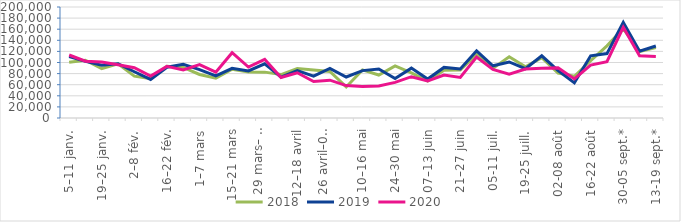
| Category | 2018 | 2019 | 2020 |
|---|---|---|---|
| 5–11 janv. | 100330 | 110701 | 113506 |
| 12–18 janv. | 104190 | 102045 | 102407 |
| 19–25 janv. | 89142 | 95260 | 100966 |
| 26 janv.–1 fév. | 97441 | 97699 | 96042 |
| 2–8 fév. | 75434 | 83347 | 90495 |
| 9–15 fév. | 71031 | 69559 | 75523 |
| 16–22 fév. | 93102 | 91428 | 93003 |
| 23–29 fév. | 91065 | 96774 | 86699 |
| 1–7 mars | 78415 | 87314 | 96119 |
| 8–14 mars | 71697 | 76021 | 82690 |
| 15–21 mars | 87845 | 89536 | 117673 |
| 22–28 mars | 82895 | 84912 | 91763.636 |
| 29 mars– 4 avril | 82654 | 97699 | 105802 |
| 5–11 avril | 78244 | 73699 | 73060.606 |
| 12–18 avril | 89129 | 85348 | 81477 |
| 19–25 avril | 86398 | 75509 | 65653 |
| 26 avril–02 mai | 83743 | 89413 | 68188 |
| 03–09 mai | 56008 | 73891 | 58423 |
| 10–16 mai | 86722 | 85364 | 56762 |
| 17–23  mai | 77423 | 88345 | 57817 |
| 24–30 mai | 93888 | 71115 | 64117 |
| 31 mai–06 juin | 81416 | 89880 | 74412 |
| 07–13 juin | 66658 | 70150 | 66851 |
| 14–20 juin | 86057 | 91157 | 77340 |
| 21–27 juin | 86474 | 88454 | 73165 |
| 28 juin–4 juil | 114502 | 121118 | 109774 |
| 05-11 juil. | 89389 | 94137 | 87596 |
| 12-18 juil. | 110384 | 100940 | 78915 |
| 19-25 juill. | 92231 | 88807 | 88097 |
| 26 juil.-01 août | 108699 | 112047 | 89418 |
| 02-08 août | 81067 | 85538 | 90304 |
| 09-15 août | 75229 | 63347 | 70433 |
| 16-22 août | 103158 | 111994 | 95333 |
| 23-29 août | 130053 | 116047 | 101359 |
| 30-05 sept.* | 161020 | 172405 | 163439 |
| 06-12 sept.* | 119903 | 120244 | 112269 |
| 13-19 sept.* | 127142 | 129807 | 110971 |